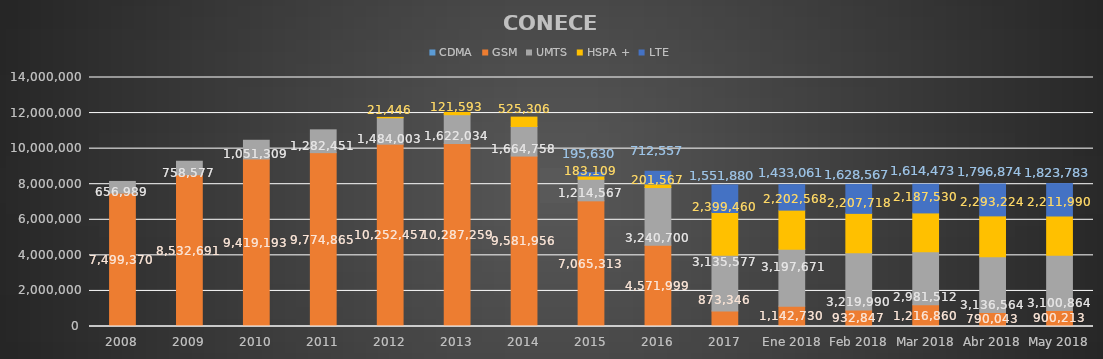
| Category | CDMA | GSM | UMTS | HSPA + | LTE |
|---|---|---|---|---|---|
| 2008 | 0 | 7499370 | 656989 | 0 | 0 |
| 2009 | 0 | 8532691 | 758577 | 0 | 0 |
| 2010 | 0 | 9419193 | 1051309 | 0 | 0 |
| 2011 | 0 | 9774865 | 1282451 | 0 | 0 |
| 2012 | 0 | 10252457 | 1484003 | 21446 | 0 |
| 2013 | 0 | 10287259 | 1622034 | 121593 | 0 |
| 2014 | 0 | 9581956 | 1664758 | 525306 | 0 |
| 2015 | 0 | 7065313 | 1214567 | 183109 | 195630 |
| 2016 | 0 | 4571999 | 3240700 | 201567 | 712557 |
| 2017 | 0 | 873346 | 3135577 | 2399460 | 1551880 |
| Ene 2018 | 0 | 1142730 | 3197671 | 2202568 | 1433061 |
| Feb 2018 | 0 | 932847 | 3219990 | 2207718 | 1628567 |
| Mar 2018 | 0 | 1216860 | 2981512 | 2187530 | 1614473 |
| Abr 2018 | 0 | 790043 | 3136564 | 2293224 | 1796874 |
| May 2018 | 0 | 900213 | 3100864 | 2211990 | 1823783 |